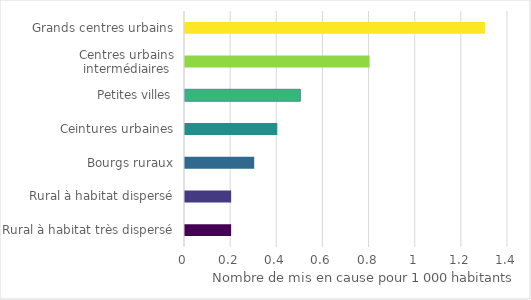
| Category | Series 0 |
|---|---|
| Grands centres urbains | 1.3 |
| Centres urbains intermédiaires | 0.8 |
| Petites villes | 0.5 |
| Ceintures urbaines | 0.4 |
| Bourgs ruraux | 0.3 |
| Rural à habitat dispersé | 0.2 |
| Rural à habitat très dispersé | 0.2 |